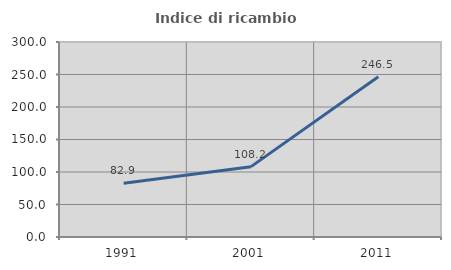
| Category | Indice di ricambio occupazionale  |
|---|---|
| 1991.0 | 82.857 |
| 2001.0 | 108.247 |
| 2011.0 | 246.479 |